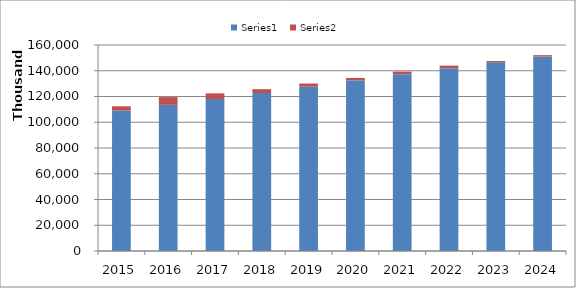
| Category | Series 0 | Series 1 |
|---|---|---|
| 2015.0 | 109104009 | 3292604 |
| 2016.0 | 113538641 | 6000000 |
| 2017.0 | 117966648 | 4500000 |
| 2018.0 | 122685314 | 3000000 |
| 2019.0 | 127592727 | 2500000 |
| 2020.0 | 132441251 | 2000000 |
| 2021.0 | 137341577 | 2000000 |
| 2022.0 | 142011191 | 2000000 |
| 2023.0 | 146555549 | 1000000 |
| 2024.0 | 151098771 | 1000000 |